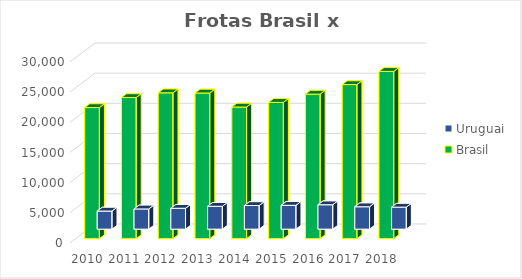
| Category | Uruguai | Brasil |
|---|---|---|
| 2010.0 | 3000 | 21734 |
| 2011.0 | 3351 | 23399 |
| 2012.0 | 3462 | 24183 |
| 2013.0 | 3785 | 24150 |
| 2014.0 | 3918 | 21826 |
| 2015.0 | 3955 | 22600 |
| 2016.0 | 4046 | 23963 |
| 2017.0 | 3713 | 25546 |
| 2018.0 | 3647 | 27731 |